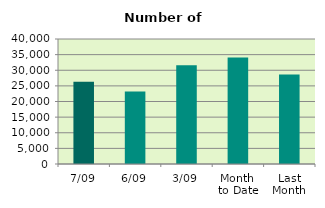
| Category | Series 0 |
|---|---|
| 7/09 | 26302 |
| 6/09 | 23192 |
| 3/09 | 31568 |
| Month 
to Date | 34077.2 |
| Last
Month | 28637.636 |